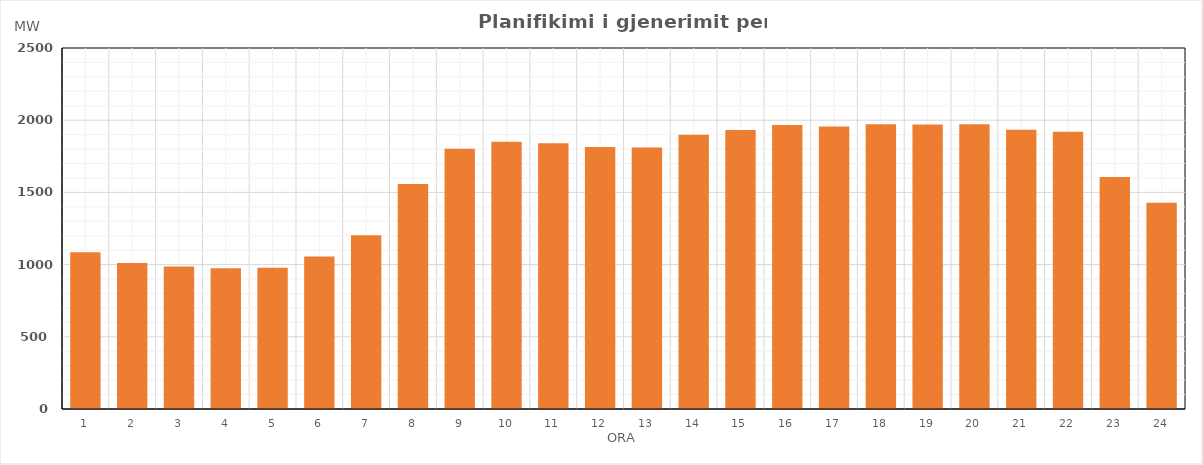
| Category | Max (MW) |
|---|---|
| 0 | 1086.06 |
| 1 | 1010.65 |
| 2 | 986.35 |
| 3 | 975.34 |
| 4 | 977.53 |
| 5 | 1055.75 |
| 6 | 1203.46 |
| 7 | 1557.77 |
| 8 | 1802.85 |
| 9 | 1850.07 |
| 10 | 1840.56 |
| 11 | 1813.73 |
| 12 | 1811.53 |
| 13 | 1899.32 |
| 14 | 1932.37 |
| 15 | 1966.65 |
| 16 | 1956.95 |
| 17 | 1972.37 |
| 18 | 1969.57 |
| 19 | 1972.22 |
| 20 | 1934.11 |
| 21 | 1919.68 |
| 22 | 1605.89 |
| 23 | 1427.66 |